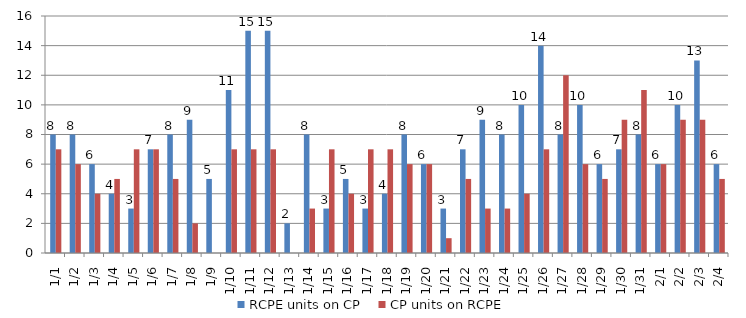
| Category | RCPE units on CP | CP units on RCPE |
|---|---|---|
| 2015-01-01 | 8 | 7 |
| 2015-01-02 | 8 | 6 |
| 2015-01-03 | 6 | 4 |
| 2015-01-04 | 4 | 5 |
| 2015-01-05 | 3 | 7 |
| 2015-01-06 | 7 | 7 |
| 2015-01-07 | 8 | 5 |
| 2015-01-08 | 9 | 2 |
| 2015-01-09 | 5 | 0 |
| 2015-01-10 | 11 | 7 |
| 2015-01-11 | 15 | 7 |
| 2015-01-12 | 15 | 7 |
| 2015-01-13 | 2 | 0 |
| 2015-01-14 | 8 | 3 |
| 2015-01-15 | 3 | 7 |
| 2015-01-16 | 5 | 4 |
| 2015-01-17 | 3 | 7 |
| 2015-01-18 | 4 | 7 |
| 2015-01-19 | 8 | 6 |
| 2015-01-20 | 6 | 6 |
| 2015-01-21 | 3 | 1 |
| 2015-01-22 | 7 | 5 |
| 2015-01-23 | 9 | 3 |
| 2015-01-24 | 8 | 3 |
| 2015-01-25 | 10 | 4 |
| 2015-01-26 | 14 | 7 |
| 2015-01-27 | 8 | 12 |
| 2015-01-28 | 10 | 6 |
| 2015-01-29 | 6 | 5 |
| 2015-01-30 | 7 | 9 |
| 2015-01-31 | 8 | 11 |
| 2015-02-01 | 6 | 6 |
| 2015-02-02 | 10 | 9 |
| 2015-02-03 | 13 | 9 |
| 2015-02-04 | 6 | 5 |